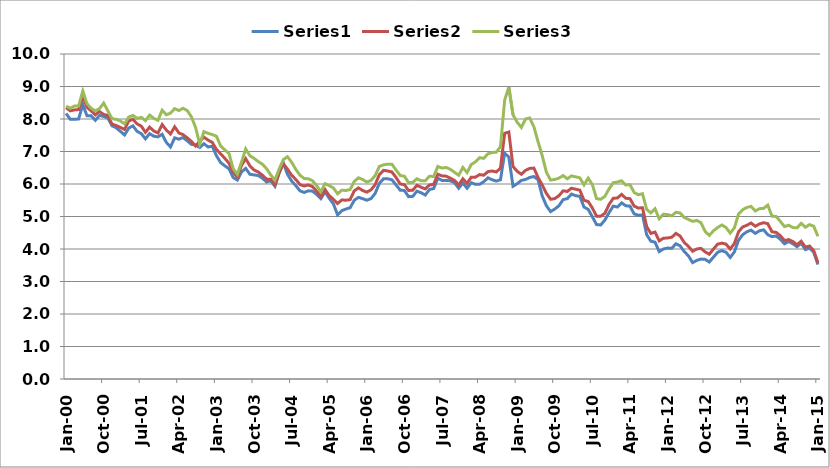
| Category | Series 0 | Series 1 | Series 2 |
|---|---|---|---|
| 2000-01-01 | 8.17 | 8.35 | 8.4 |
| 2000-02-01 | 7.99 | 8.25 | 8.33 |
| 2000-03-01 | 7.99 | 8.28 | 8.4 |
| 2000-04-01 | 8 | 8.29 | 8.4 |
| 2000-05-01 | 8.44 | 8.7 | 8.86 |
| 2000-06-01 | 8.1 | 8.36 | 8.47 |
| 2000-07-01 | 8.1 | 8.25 | 8.33 |
| 2000-08-01 | 7.96 | 8.13 | 8.25 |
| 2000-09-01 | 8.11 | 8.23 | 8.32 |
| 2000-10-01 | 8.08 | 8.14 | 8.49 |
| 2000-11-01 | 8.03 | 8.11 | 8.25 |
| 2000-12-01 | 7.79 | 7.84 | 8.01 |
| 2001-01-01 | 7.73 | 7.8 | 7.99 |
| 2001-02-01 | 7.62 | 7.74 | 7.94 |
| 2001-03-01 | 7.51 | 7.68 | 7.85 |
| 2001-04-01 | 7.72 | 7.94 | 8.06 |
| 2001-05-01 | 7.79 | 7.99 | 8.11 |
| 2001-06-01 | 7.62 | 7.85 | 8.02 |
| 2001-07-01 | 7.55 | 7.78 | 8.05 |
| 2001-08-01 | 7.39 | 7.59 | 7.95 |
| 2001-09-01 | 7.55 | 7.75 | 8.12 |
| 2001-10-01 | 7.47 | 7.63 | 8.02 |
| 2001-11-01 | 7.45 | 7.57 | 7.96 |
| 2001-12-01 | 7.53 | 7.83 | 8.27 |
| 2002-01-01 | 7.28 | 7.66 | 8.13 |
| 2002-02-01 | 7.14 | 7.54 | 8.18 |
| 2002-03-01 | 7.42 | 7.76 | 8.32 |
| 2002-04-01 | 7.38 | 7.57 | 8.26 |
| 2002-05-01 | 7.43 | 7.52 | 8.33 |
| 2002-06-01 | 7.33 | 7.42 | 8.26 |
| 2002-07-01 | 7.22 | 7.31 | 8.07 |
| 2002-08-01 | 7.2 | 7.17 | 7.74 |
| 2002-09-01 | 7.12 | 7.32 | 7.23 |
| 2002-10-01 | 7.24 | 7.44 | 7.61 |
| 2002-11-01 | 7.14 | 7.35 | 7.56 |
| 2002-12-01 | 7.16 | 7.28 | 7.52 |
| 2003-01-01 | 6.87 | 7.06 | 7.47 |
| 2003-02-01 | 6.66 | 6.93 | 7.17 |
| 2003-03-01 | 6.56 | 6.79 | 7.05 |
| 2003-04-01 | 6.47 | 6.64 | 6.94 |
| 2003-05-01 | 6.2 | 6.36 | 6.47 |
| 2003-06-01 | 6.12 | 6.21 | 6.3 |
| 2003-07-01 | 6.37 | 6.57 | 6.67 |
| 2003-08-01 | 6.48 | 6.78 | 7.08 |
| 2003-09-01 | 6.3 | 6.56 | 6.87 |
| 2003-10-01 | 6.28 | 6.43 | 6.79 |
| 2003-11-01 | 6.26 | 6.37 | 6.69 |
| 2003-12-01 | 6.18 | 6.27 | 6.61 |
| 2004-01-01 | 6.06 | 6.15 | 6.47 |
| 2004-02-01 | 6.1 | 6.15 | 6.28 |
| 2004-03-01 | 5.93 | 5.97 | 6.12 |
| 2004-04-01 | 6.33 | 6.35 | 6.46 |
| 2004-05-01 | 6.66 | 6.62 | 6.75 |
| 2004-06-01 | 6.3 | 6.46 | 6.84 |
| 2004-07-01 | 6.09 | 6.27 | 6.67 |
| 2004-08-01 | 5.95 | 6.14 | 6.45 |
| 2004-09-01 | 5.79 | 5.98 | 6.27 |
| 2004-10-01 | 5.74 | 5.94 | 6.17 |
| 2004-11-01 | 5.79 | 5.97 | 6.16 |
| 2004-12-01 | 5.78 | 5.92 | 6.1 |
| 2005-01-01 | 5.68 | 5.78 | 5.95 |
| 2005-02-01 | 5.55 | 5.61 | 5.76 |
| 2005-03-01 | 5.76 | 5.83 | 6.01 |
| 2005-04-01 | 5.56 | 5.64 | 5.95 |
| 2005-05-01 | 5.39 | 5.53 | 5.88 |
| 2005-06-01 | 5.05 | 5.4 | 5.7 |
| 2005-07-01 | 5.18 | 5.51 | 5.81 |
| 2005-08-01 | 5.23 | 5.5 | 5.8 |
| 2005-09-01 | 5.27 | 5.52 | 5.83 |
| 2005-10-01 | 5.5 | 5.79 | 6.08 |
| 2005-11-01 | 5.59 | 5.88 | 6.19 |
| 2005-12-01 | 5.55 | 5.8 | 6.14 |
| 2006-01-01 | 5.5 | 5.75 | 6.06 |
| 2006-02-01 | 5.55 | 5.82 | 6.11 |
| 2006-03-01 | 5.71 | 5.98 | 6.26 |
| 2006-04-01 | 6.02 | 6.29 | 6.54 |
| 2006-05-01 | 6.16 | 6.42 | 6.59 |
| 2006-06-01 | 6.16 | 6.4 | 6.61 |
| 2006-07-01 | 6.13 | 6.37 | 6.61 |
| 2006-08-01 | 5.97 | 6.2 | 6.43 |
| 2006-09-01 | 5.81 | 6 | 6.26 |
| 2006-10-01 | 5.8 | 5.98 | 6.24 |
| 2006-11-01 | 5.61 | 5.8 | 6.04 |
| 2006-12-01 | 5.62 | 5.81 | 6.05 |
| 2007-01-01 | 5.78 | 5.96 | 6.16 |
| 2007-02-01 | 5.73 | 5.9 | 6.1 |
| 2007-03-01 | 5.66 | 5.85 | 6.1 |
| 2007-04-01 | 5.83 | 5.97 | 6.24 |
| 2007-05-01 | 5.86 | 5.99 | 6.23 |
| 2007-06-01 | 6.18 | 6.3 | 6.54 |
| 2007-07-01 | 6.11 | 6.25 | 6.49 |
| 2007-08-01 | 6.11 | 6.24 | 6.51 |
| 2007-09-01 | 6.1 | 6.18 | 6.45 |
| 2007-10-01 | 6.04 | 6.11 | 6.36 |
| 2007-11-01 | 5.87 | 5.97 | 6.27 |
| 2007-12-01 | 6.03 | 6.16 | 6.51 |
| 2008-01-01 | 5.87 | 6.02 | 6.35 |
| 2008-02-01 | 6.04 | 6.21 | 6.6 |
| 2008-03-01 | 5.99 | 6.21 | 6.68 |
| 2008-04-01 | 5.99 | 6.29 | 6.81 |
| 2008-05-01 | 6.07 | 6.27 | 6.79 |
| 2008-06-01 | 6.19 | 6.38 | 6.93 |
| 2008-07-01 | 6.13 | 6.4 | 6.97 |
| 2008-08-01 | 6.09 | 6.37 | 6.98 |
| 2008-09-01 | 6.13 | 6.49 | 7.15 |
| 2008-10-01 | 6.95 | 7.56 | 8.58 |
| 2008-11-01 | 6.83 | 7.6 | 8.98 |
| 2008-12-01 | 5.93 | 6.54 | 8.13 |
| 2009-01-01 | 6.01 | 6.39 | 7.9 |
| 2009-02-01 | 6.11 | 6.3 | 7.74 |
| 2009-03-01 | 6.14 | 6.42 | 8 |
| 2009-04-01 | 6.2 | 6.48 | 8.03 |
| 2009-05-01 | 6.23 | 6.49 | 7.76 |
| 2009-06-01 | 6.13 | 6.2 | 7.3 |
| 2009-07-01 | 5.63 | 5.97 | 6.87 |
| 2009-08-01 | 5.33 | 5.71 | 6.36 |
| 2009-09-01 | 5.15 | 5.53 | 6.12 |
| 2009-10-01 | 5.23 | 5.55 | 6.14 |
| 2009-11-01 | 5.33 | 5.64 | 6.18 |
| 2009-12-01 | 5.52 | 5.79 | 6.26 |
| 2010-01-01 | 5.55 | 5.77 | 6.16 |
| 2010-02-01 | 5.69 | 5.87 | 6.25 |
| 2010-03-01 | 5.64 | 5.84 | 6.22 |
| 2010-04-01 | 5.62 | 5.81 | 6.19 |
| 2010-05-01 | 5.29 | 5.5 | 5.97 |
| 2010-06-01 | 5.22 | 5.46 | 6.18 |
| 2010-07-01 | 4.99 | 5.26 | 5.98 |
| 2010-08-01 | 4.75 | 5.01 | 5.55 |
| 2010-09-01 | 4.74 | 5.01 | 5.53 |
| 2010-10-01 | 4.89 | 5.1 | 5.62 |
| 2010-11-01 | 5.12 | 5.37 | 5.85 |
| 2010-12-01 | 5.32 | 5.56 | 6.04 |
| 2011-01-01 | 5.29 | 5.57 | 6.06 |
| 2011-02-01 | 5.42 | 5.68 | 6.1 |
| 2011-03-01 | 5.33 | 5.56 | 5.97 |
| 2011-04-01 | 5.32 | 5.55 | 5.98 |
| 2011-05-01 | 5.08 | 5.32 | 5.74 |
| 2011-06-01 | 5.04 | 5.26 | 5.67 |
| 2011-07-01 | 5.05 | 5.27 | 5.7 |
| 2011-08-01 | 4.44 | 4.69 | 5.22 |
| 2011-09-01 | 4.24 | 4.48 | 5.11 |
| 2011-10-01 | 4.21 | 4.52 | 5.24 |
| 2011-11-01 | 3.92 | 4.25 | 4.93 |
| 2011-12-01 | 4 | 4.33 | 5.07 |
| 2012-01-01 | 4.03 | 4.34 | 5.06 |
| 2012-02-01 | 4.02 | 4.36 | 5.02 |
| 2012-03-01 | 4.16 | 4.48 | 5.13 |
| 2012-04-01 | 4.1 | 4.4 | 5.11 |
| 2012-05-01 | 3.92 | 4.2 | 4.97 |
| 2012-06-01 | 3.79 | 4.08 | 4.91 |
| 2012-07-01 | 3.58 | 3.93 | 4.85 |
| 2012-08-01 | 3.65 | 4 | 4.88 |
| 2012-09-01 | 3.69 | 4.02 | 4.81 |
| 2012-10-01 | 3.68 | 3.91 | 4.54 |
| 2012-11-01 | 3.6 | 3.84 | 4.42 |
| 2012-12-01 | 3.75 | 4 | 4.56 |
| 2013-01-01 | 3.9 | 4.15 | 4.66 |
| 2013-02-01 | 3.95 | 4.18 | 4.74 |
| 2013-03-01 | 3.9 | 4.15 | 4.66 |
| 2013-04-01 | 3.74 | 4 | 4.49 |
| 2013-05-01 | 3.91 | 4.17 | 4.65 |
| 2013-06-01 | 4.27 | 4.53 | 5.08 |
| 2013-07-01 | 4.44 | 4.68 | 5.21 |
| 2013-08-01 | 4.53 | 4.73 | 5.28 |
| 2013-09-01 | 4.58 | 4.8 | 5.31 |
| 2013-10-01 | 4.48 | 4.7 | 5.17 |
| 2013-11-01 | 4.56 | 4.77 | 5.24 |
| 2013-12-01 | 4.59 | 4.81 | 5.25 |
| 2014-01-01 | 4.44 | 4.778 | 5.351 |
| 2014-02-01 | 4.38 | 4.53 | 5.01 |
| 2014-03-01 | 4.4 | 4.51 | 5 |
| 2014-04-01 | 4.3 | 4.41 | 4.85 |
| 2014-05-01 | 4.16 | 4.26 | 4.69 |
| 2014-06-01 | 4.23 | 4.29 | 4.73 |
| 2014-07-01 | 4.16 | 4.23 | 4.66 |
| 2014-08-01 | 4.07 | 4.13 | 4.65 |
| 2014-09-01 | 4.18 | 4.24 | 4.79 |
| 2014-10-01 | 3.98 | 4.06 | 4.67 |
| 2014-11-01 | 4.03 | 4.09 | 4.75 |
| 2014-12-01 | 3.9 | 3.95 | 4.7 |
| 2015-01-01 | 3.52 | 3.58 | 4.39 |